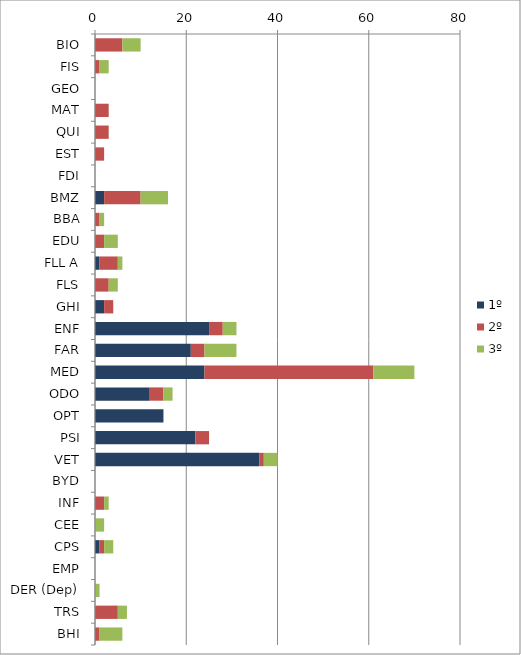
| Category | 1º | 2º | 3º |
|---|---|---|---|
| BIO | 0 | 6 | 4 |
| FIS | 0 | 1 | 2 |
| GEO | 0 | 0 | 0 |
| MAT | 0 | 3 | 0 |
| QUI | 0 | 3 | 0 |
| EST | 0 | 2 | 0 |
| FDI | 0 | 0 | 0 |
| BMZ | 2 | 8 | 6 |
| BBA | 0 | 1 | 1 |
| EDU | 0 | 2 | 3 |
| FLL A | 1 | 4 | 1 |
| FLS | 0 | 3 | 2 |
| GHI | 2 | 2 | 0 |
| ENF | 25 | 3 | 3 |
| FAR | 21 | 3 | 7 |
| MED | 24 | 37 | 9 |
| ODO | 12 | 3 | 2 |
| OPT | 15 | 0 | 0 |
| PSI | 22 | 3 | 0 |
| VET | 36 | 1 | 3 |
| BYD | 0 | 0 | 0 |
| INF | 0 | 2 | 1 |
| CEE | 0 | 0 | 2 |
| CPS | 1 | 1 | 2 |
| EMP | 0 | 0 | 0 |
| DER (Dep) | 0 | 0 | 1 |
| TRS | 0 | 5 | 2 |
| BHI | 0 | 1 | 5 |